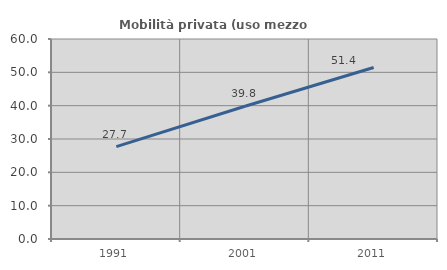
| Category | Mobilità privata (uso mezzo privato) |
|---|---|
| 1991.0 | 27.727 |
| 2001.0 | 39.808 |
| 2011.0 | 51.436 |